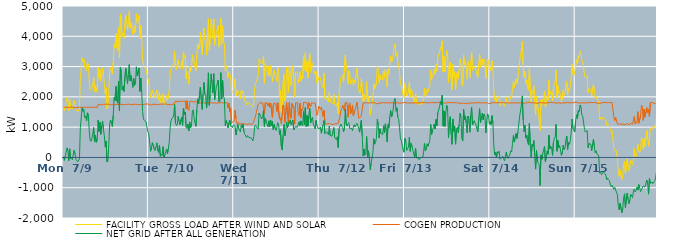
| Category | FACILITY GROSS LOAD AFTER WIND AND SOLAR | COGEN PRODUCTION | NET GRID AFTER ALL GENERATION |
|---|---|---|---|
|  Mon  7/9 | 1678 | 1658 | 20 |
|  Mon  7/9 | 1553 | 1650 | -97 |
|  Mon  7/9 | 1692 | 1657 | 35 |
|  Mon  7/9 | 1666 | 1654 | 12 |
|  Mon  7/9 | 1974 | 1661 | 313 |
|  Mon  7/9 | 1856 | 1638 | 218 |
|  Mon  7/9 | 1541 | 1649 | -108 |
|  Mon  7/9 | 1927 | 1642 | 285 |
|  Mon  7/9 | 1615 | 1661 | -46 |
|  Mon  7/9 | 1659 | 1652 | 7 |
|  Mon  7/9 | 1591 | 1665 | -74 |
|  Mon  7/9 | 1601 | 1652 | -51 |
|  Mon  7/9 | 1880 | 1647 | 233 |
|  Mon  7/9 | 1773 | 1654 | 119 |
|  Mon  7/9 | 1583 | 1644 | -61 |
|  Mon  7/9 | 1572 | 1664 | -92 |
|  Mon  7/9 | 1509 | 1652 | -143 |
|  Mon  7/9 | 1478 | 1648 | -170 |
|  Mon  7/9 | 1608 | 1658 | -50 |
|  Mon  7/9 | 2626 | 1646 | 980 |
|  Mon  7/9 | 2955 | 1654 | 1301 |
|  Mon  7/9 | 3286 | 1650 | 1636 |
|  Mon  7/9 | 3170 | 1649 | 1521 |
|  Mon  7/9 | 3247 | 1661 | 1586 |
|  Mon  7/9 | 2968 | 1654 | 1314 |
|  Mon  7/9 | 3022 | 1652 | 1370 |
|  Mon  7/9 | 2860 | 1658 | 1202 |
|  Mon  7/9 | 3134 | 1662 | 1472 |
|  Mon  7/9 | 3058 | 1661 | 1397 |
|  Mon  7/9 | 2560 | 1666 | 894 |
|  Mon  7/9 | 2221 | 1651 | 570 |
|  Mon  7/9 | 2196 | 1665 | 531 |
|  Mon  7/9 | 2284 | 1665 | 619 |
|  Mon  7/9 | 2429 | 1648 | 781 |
|  Mon  7/9 | 2636 | 1649 | 987 |
|  Mon  7/9 | 2160 | 1652 | 508 |
|  Mon  7/9 | 2381 | 1655 | 726 |
|  Mon  7/9 | 2156 | 1659 | 497 |
|  Mon  7/9 | 2262 | 1649 | 613 |
|  Mon  7/9 | 2984 | 1751 | 1233 |
|  Mon  7/9 | 2602 | 1749 | 853 |
|  Mon  7/9 | 2897 | 1732 | 1165 |
|  Mon  7/9 | 2519 | 1756 | 763 |
|  Mon  7/9 | 2778 | 1740 | 1038 |
|  Mon  7/9 | 2958 | 1761 | 1197 |
|  Mon  7/9 | 2671 | 1757 | 914 |
|  Mon  7/9 | 2457 | 1744 | 713 |
|  Mon  7/9 | 2095 | 1754 | 341 |
|  Mon  7/9 | 2309 | 1766 | 543 |
|  Mon  7/9 | 1607 | 1759 | -152 |
|  Mon  7/9 | 1644 | 1748 | -104 |
|  Mon  7/9 | 2169 | 1757 | 412 |
|  Mon  7/9 | 2860 | 1750 | 1110 |
|  Mon  7/9 | 2966 | 1730 | 1236 |
|  Mon  7/9 | 2861 | 1738 | 1123 |
|  Mon  7/9 | 2765 | 1750 | 1015 |
|  Mon  7/9 | 3154 | 1760 | 1394 |
|  Mon  7/9 | 3733 | 1753 | 1980 |
|  Mon  7/9 | 3624 | 1746 | 1878 |
|  Mon  7/9 | 4086 | 1745 | 2341 |
|  Mon  7/9 | 3622 | 1756 | 1866 |
|  Mon  7/9 | 3537 | 1748 | 1789 |
|  Mon  7/9 | 4282 | 1765 | 2517 |
|  Mon  7/9 | 3290 | 1753 | 1537 |
|  Mon  7/9 | 4743 | 1761 | 2982 |
|  Mon  7/9 | 4587 | 1755 | 2832 |
|  Mon  7/9 | 3975 | 1751 | 2224 |
|  Mon  7/9 | 4095 | 1743 | 2352 |
|  Mon  7/9 | 3936 | 1756 | 2180 |
|  Mon  7/9 | 3935 | 1745 | 2190 |
|  Mon  7/9 | 4697 | 1752 | 2945 |
|  Mon  7/9 | 4514 | 1751 | 2763 |
|  Mon  7/9 | 4197 | 1761 | 2436 |
|  Mon  7/9 | 4495 | 1761 | 2734 |
|  Mon  7/9 | 4827 | 1761 | 3066 |
|  Mon  7/9 | 4269 | 1745 | 2524 |
|  Mon  7/9 | 4457 | 1754 | 2703 |
|  Mon  7/9 | 4271 | 1747 | 2524 |
|  Mon  7/9 | 4061 | 1746 | 2315 |
|  Mon  7/9 | 4371 | 1756 | 2615 |
|  Mon  7/9 | 4116 | 1735 | 2381 |
|  Mon  7/9 | 4187 | 1755 | 2432 |
|  Mon  7/9 | 4749 | 1757 | 2992 |
|  Mon  7/9 | 4442 | 1751 | 2691 |
|  Mon  7/9 | 4416 | 1755 | 2661 |
|  Mon  7/9 | 4694 | 1745 | 2949 |
|  Mon  7/9 | 3934 | 1754 | 2180 |
|  Mon  7/9 | 4362 | 1739 | 2623 |
|  Mon  7/9 | 3905 | 1733 | 2172 |
|  Mon  7/9 | 3261 | 1748 | 1513 |
|  Mon  7/9 | 3025 | 1755 | 1270 |
|  Mon  7/9 | 2971 | 1751 | 1220 |
|  Mon  7/9 | 2986 | 1751 | 1235 |
|  Mon  7/9 | 2934 | 1765 | 1169 |
|  Mon  7/9 | 2727 | 1751 | 976 |
|  Mon  7/9 | 2609 | 1764 | 845 |
|  Tue  7/10 | 2511 | 1740 | 771 |
|  Tue  7/10 | 2527 | 1738 | 789 |
|  Tue  7/10 | 1964 | 1760 | 204 |
|  Tue  7/10 | 2064 | 1732 | 332 |
|  Tue  7/10 | 2225 | 1738 | 487 |
|  Tue  7/10 | 2226 | 1755 | 471 |
|  Tue  7/10 | 2043 | 1752 | 291 |
|  Tue  7/10 | 1980 | 1755 | 225 |
|  Tue  7/10 | 1975 | 1759 | 216 |
|  Tue  7/10 | 2229 | 1750 | 479 |
|  Tue  7/10 | 1998 | 1754 | 244 |
|  Tue  7/10 | 1905 | 1741 | 164 |
|  Tue  7/10 | 2149 | 1750 | 399 |
|  Tue  7/10 | 1795 | 1758 | 37 |
|  Tue  7/10 | 1856 | 1744 | 112 |
|  Tue  7/10 | 1821 | 1756 | 65 |
|  Tue  7/10 | 2099 | 1743 | 356 |
|  Tue  7/10 | 1757 | 1762 | -5 |
|  Tue  7/10 | 1855 | 1765 | 90 |
|  Tue  7/10 | 1835 | 1769 | 66 |
|  Tue  7/10 | 2040 | 1761 | 279 |
|  Tue  7/10 | 1873 | 1749 | 124 |
|  Tue  7/10 | 2047 | 1750 | 297 |
|  Tue  7/10 | 2240 | 1748 | 492 |
|  Tue  7/10 | 2740 | 1739 | 1001 |
|  Tue  7/10 | 2940 | 1728 | 1212 |
|  Tue  7/10 | 3047 | 1766 | 1281 |
|  Tue  7/10 | 3004 | 1745 | 1259 |
|  Tue  7/10 | 3111 | 1742 | 1369 |
|  Tue  7/10 | 3507 | 1757 | 1750 |
|  Tue  7/10 | 3002 | 1863 | 1139 |
|  Tue  7/10 | 2897 | 1846 | 1051 |
|  Tue  7/10 | 2913 | 1827 | 1086 |
|  Tue  7/10 | 3224 | 1869 | 1355 |
|  Tue  7/10 | 3064 | 1868 | 1196 |
|  Tue  7/10 | 2931 | 1846 | 1085 |
|  Tue  7/10 | 2970 | 1871 | 1099 |
|  Tue  7/10 | 3183 | 1853 | 1330 |
|  Tue  7/10 | 2920 | 1861 | 1059 |
|  Tue  7/10 | 3487 | 1857 | 1630 |
|  Tue  7/10 | 3293 | 1871 | 1422 |
|  Tue  7/10 | 3355 | 1857 | 1498 |
|  Tue  7/10 | 2591 | 1594 | 997 |
|  Tue  7/10 | 2827 | 1873 | 954 |
|  Tue  7/10 | 2702 | 1600 | 1102 |
|  Tue  7/10 | 2427 | 1550 | 877 |
|  Tue  7/10 | 3025 | 1854 | 1171 |
|  Tue  7/10 | 2837 | 1852 | 985 |
|  Tue  7/10 | 2917 | 1853 | 1064 |
|  Tue  7/10 | 3388 | 1862 | 1526 |
|  Tue  7/10 | 3405 | 1833 | 1572 |
|  Tue  7/10 | 3127 | 1848 | 1279 |
|  Tue  7/10 | 2964 | 1838 | 1126 |
|  Tue  7/10 | 2859 | 1831 | 1028 |
|  Tue  7/10 | 3396 | 1834 | 1562 |
|  Tue  7/10 | 3743 | 1811 | 1932 |
|  Tue  7/10 | 3581 | 1806 | 1775 |
|  Tue  7/10 | 3617 | 1815 | 1802 |
|  Tue  7/10 | 4118 | 1795 | 2323 |
|  Tue  7/10 | 3704 | 1795 | 1909 |
|  Tue  7/10 | 3393 | 1808 | 1585 |
|  Tue  7/10 | 3895 | 1805 | 2090 |
|  Tue  7/10 | 4275 | 1800 | 2475 |
|  Tue  7/10 | 3890 | 1799 | 2091 |
|  Tue  7/10 | 3836 | 1808 | 2028 |
|  Tue  7/10 | 3377 | 1747 | 1630 |
|  Tue  7/10 | 3956 | 1801 | 2155 |
|  Tue  7/10 | 4587 | 1794 | 2793 |
|  Tue  7/10 | 3519 | 1798 | 1721 |
|  Tue  7/10 | 3877 | 1814 | 2063 |
|  Tue  7/10 | 4572 | 1814 | 2758 |
|  Tue  7/10 | 4285 | 1811 | 2474 |
|  Tue  7/10 | 3917 | 1783 | 2134 |
|  Tue  7/10 | 4574 | 1809 | 2765 |
|  Tue  7/10 | 3706 | 1807 | 1899 |
|  Tue  7/10 | 3917 | 1795 | 2122 |
|  Tue  7/10 | 4152 | 1785 | 2367 |
|  Tue  7/10 | 4237 | 1817 | 2420 |
|  Tue  7/10 | 4361 | 1805 | 2556 |
|  Tue  7/10 | 3643 | 1807 | 1836 |
|  Tue  7/10 | 3680 | 1804 | 1876 |
|  Tue  7/10 | 4595 | 1794 | 2801 |
|  Tue  7/10 | 3742 | 1809 | 1933 |
|  Tue  7/10 | 4346 | 1806 | 2540 |
|  Tue  7/10 | 3818 | 1799 | 2019 |
|  Tue  7/10 | 3745 | 1808 | 1937 |
|  Tue  7/10 | 2849 | 1802 | 1047 |
|  Tue  7/10 | 3034 | 1813 | 1221 |
|  Tue  7/10 | 2946 | 1818 | 1128 |
|  Tue  7/10 | 2617 | 1642 | 975 |
|  Tue  7/10 | 2796 | 1794 | 1002 |
|  Tue  7/10 | 2745 | 1509 | 1236 |
|  Tue  7/10 | 2686 | 1641 | 1045 |
|  Tue  7/10 | 2188 | 1118 | 1070 |
|  Tue  7/10 | 2153 | 1170 | 983 |
|  Tue  7/10 | 2218 | 1146 | 1072 |
|  Wed  7/11 | 2291 | 1201 | 1090 |
|  Wed  7/11 | 2594 | 1560 | 1034 |
|  Wed  7/11 | 2035 | 1298 | 737 |
|  Wed  7/11 | 2027 | 1116 | 911 |
|  Wed  7/11 | 2219 | 1117 | 1102 |
|  Wed  7/11 | 2115 | 1161 | 954 |
|  Wed  7/11 | 2015 | 1090 | 925 |
|  Wed  7/11 | 1940 | 1092 | 848 |
|  Wed  7/11 | 2200 | 1122 | 1078 |
|  Wed  7/11 | 2122 | 1142 | 980 |
|  Wed  7/11 | 2202 | 1105 | 1097 |
|  Wed  7/11 | 1959 | 1117 | 842 |
|  Wed  7/11 | 1875 | 1113 | 762 |
|  Wed  7/11 | 1884 | 1105 | 779 |
|  Wed  7/11 | 1742 | 1082 | 660 |
|  Wed  7/11 | 1835 | 1113 | 722 |
|  Wed  7/11 | 1776 | 1106 | 670 |
|  Wed  7/11 | 1773 | 1106 | 667 |
|  Wed  7/11 | 1760 | 1109 | 651 |
|  Wed  7/11 | 1765 | 1108 | 657 |
|  Wed  7/11 | 1698 | 1075 | 623 |
|  Wed  7/11 | 1663 | 1117 | 546 |
|  Wed  7/11 | 1788 | 1107 | 681 |
|  Wed  7/11 | 2286 | 1275 | 1011 |
|  Wed  7/11 | 2442 | 1367 | 1075 |
|  Wed  7/11 | 2502 | 1488 | 1014 |
|  Wed  7/11 | 2602 | 1619 | 983 |
|  Wed  7/11 | 2677 | 1745 | 932 |
|  Wed  7/11 | 3253 | 1786 | 1467 |
|  Wed  7/11 | 3182 | 1787 | 1395 |
|  Wed  7/11 | 3198 | 1810 | 1388 |
|  Wed  7/11 | 3086 | 1816 | 1270 |
|  Wed  7/11 | 3155 | 1802 | 1353 |
|  Wed  7/11 | 3352 | 1807 | 1545 |
|  Wed  7/11 | 2448 | 1437 | 1011 |
|  Wed  7/11 | 3096 | 1808 | 1288 |
|  Wed  7/11 | 2977 | 1792 | 1185 |
|  Wed  7/11 | 2960 | 1793 | 1167 |
|  Wed  7/11 | 2709 | 1695 | 1014 |
|  Wed  7/11 | 3011 | 1801 | 1210 |
|  Wed  7/11 | 2674 | 1661 | 1013 |
|  Wed  7/11 | 3032 | 1796 | 1236 |
|  Wed  7/11 | 2855 | 1812 | 1043 |
|  Wed  7/11 | 2508 | 1321 | 1187 |
|  Wed  7/11 | 2651 | 1743 | 908 |
|  Wed  7/11 | 2890 | 1803 | 1087 |
|  Wed  7/11 | 2722 | 1747 | 975 |
|  Wed  7/11 | 2674 | 1785 | 889 |
|  Wed  7/11 | 2514 | 1515 | 999 |
|  Wed  7/11 | 2959 | 1807 | 1152 |
|  Wed  7/11 | 2899 | 1814 | 1085 |
|  Wed  7/11 | 2018 | 1264 | 754 |
|  Wed  7/11 | 2217 | 1307 | 910 |
|  Wed  7/11 | 1482 | 1110 | 372 |
|  Wed  7/11 | 1352 | 1109 | 243 |
|  Wed  7/11 | 2462 | 1732 | 730 |
|  Wed  7/11 | 2754 | 1659 | 1095 |
|  Wed  7/11 | 1864 | 1149 | 715 |
|  Wed  7/11 | 2009 | 1126 | 883 |
|  Wed  7/11 | 2977 | 1810 | 1167 |
|  Wed  7/11 | 2779 | 1796 | 983 |
|  Wed  7/11 | 2138 | 1139 | 999 |
|  Wed  7/11 | 2996 | 1814 | 1182 |
|  Wed  7/11 | 2657 | 1413 | 1244 |
|  Wed  7/11 | 2369 | 1292 | 1077 |
|  Wed  7/11 | 2938 | 1779 | 1159 |
|  Wed  7/11 | 3027 | 1791 | 1236 |
|  Wed  7/11 | 2558 | 1652 | 906 |
|  Wed  7/11 | 1996 | 1099 | 897 |
|  Wed  7/11 | 2819 | 1800 | 1019 |
|  Wed  7/11 | 2796 | 1797 | 999 |
|  Wed  7/11 | 2807 | 1814 | 993 |
|  Wed  7/11 | 2453 | 1481 | 972 |
|  Wed  7/11 | 2563 | 1386 | 1177 |
|  Wed  7/11 | 2833 | 1790 | 1043 |
|  Wed  7/11 | 2520 | 1315 | 1205 |
|  Wed  7/11 | 2691 | 1595 | 1096 |
|  Wed  7/11 | 2594 | 1555 | 1039 |
|  Wed  7/11 | 3330 | 1814 | 1516 |
|  Wed  7/11 | 2882 | 1809 | 1073 |
|  Wed  7/11 | 3457 | 1814 | 1643 |
|  Wed  7/11 | 2818 | 1794 | 1024 |
|  Wed  7/11 | 3181 | 1798 | 1383 |
|  Wed  7/11 | 2630 | 1598 | 1032 |
|  Wed  7/11 | 3197 | 1811 | 1386 |
|  Wed  7/11 | 3430 | 1814 | 1616 |
|  Wed  7/11 | 2806 | 1666 | 1140 |
|  Wed  7/11 | 3066 | 1800 | 1266 |
|  Wed  7/11 | 3116 | 1794 | 1322 |
|  Wed  7/11 | 2910 | 1798 | 1112 |
|  Wed  7/11 | 2895 | 1805 | 1090 |
|  Wed  7/11 | 2744 | 1797 | 947 |
|  Wed  7/11 | 2840 | 1617 | 1223 |
|  Wed  7/11 | 2451 | 1386 | 1065 |
|  Wed  7/11 | 2479 | 1445 | 1034 |
|  Wed  7/11 | 2628 | 1692 | 936 |
|  Thu  7/12 | 2688 | 1721 | 967 |
|  Thu  7/12 | 2587 | 1587 | 1000 |
|  Thu  7/12 | 2462 | 1663 | 799 |
|  Thu  7/12 | 2475 | 1521 | 954 |
|  Thu  7/12 | 2299 | 1354 | 945 |
|  Thu  7/12 | 2773 | 1555 | 1218 |
|  Thu  7/12 | 1955 | 1171 | 784 |
|  Thu  7/12 | 1902 | 1099 | 803 |
|  Thu  7/12 | 1950 | 1101 | 849 |
|  Thu  7/12 | 1919 | 1111 | 808 |
|  Thu  7/12 | 1828 | 1081 | 747 |
|  Thu  7/12 | 2154 | 1120 | 1034 |
|  Thu  7/12 | 1832 | 1109 | 723 |
|  Thu  7/12 | 1834 | 1097 | 737 |
|  Thu  7/12 | 1816 | 1112 | 704 |
|  Thu  7/12 | 1777 | 1082 | 695 |
|  Thu  7/12 | 2091 | 1105 | 986 |
|  Thu  7/12 | 1767 | 1111 | 656 |
|  Thu  7/12 | 1746 | 1110 | 636 |
|  Thu  7/12 | 1694 | 1113 | 581 |
|  Thu  7/12 | 1807 | 1126 | 681 |
|  Thu  7/12 | 1451 | 1122 | 329 |
|  Thu  7/12 | 2076 | 1134 | 942 |
|  Thu  7/12 | 2396 | 1361 | 1035 |
|  Thu  7/12 | 2646 | 1543 | 1103 |
|  Thu  7/12 | 2635 | 1598 | 1037 |
|  Thu  7/12 | 2713 | 1727 | 986 |
|  Thu  7/12 | 2483 | 1631 | 852 |
|  Thu  7/12 | 2498 | 1530 | 968 |
|  Thu  7/12 | 3386 | 1804 | 1582 |
|  Thu  7/12 | 2910 | 1808 | 1102 |
|  Thu  7/12 | 2844 | 1807 | 1037 |
|  Thu  7/12 | 2436 | 1329 | 1107 |
|  Thu  7/12 | 2865 | 1719 | 1146 |
|  Thu  7/12 | 2749 | 1796 | 953 |
|  Thu  7/12 | 2415 | 1444 | 971 |
|  Thu  7/12 | 2530 | 1567 | 963 |
|  Thu  7/12 | 2601 | 1724 | 877 |
|  Thu  7/12 | 2379 | 1379 | 1000 |
|  Thu  7/12 | 2549 | 1463 | 1086 |
|  Thu  7/12 | 2455 | 1452 | 1003 |
|  Thu  7/12 | 2700 | 1699 | 1001 |
|  Thu  7/12 | 2945 | 1819 | 1126 |
|  Thu  7/12 | 2660 | 1600 | 1060 |
|  Thu  7/12 | 2264 | 1299 | 965 |
|  Thu  7/12 | 2108 | 1272 | 836 |
|  Thu  7/12 | 2160 | 1325 | 835 |
|  Thu  7/12 | 2610 | 1387 | 1223 |
|  Thu  7/12 | 2305 | 1587 | 718 |
|  Thu  7/12 | 1847 | 1801 | 46 |
|  Thu  7/12 | 2089 | 1809 | 280 |
|  Thu  7/12 | 1870 | 1798 | 72 |
|  Thu  7/12 | 1925 | 1796 | 129 |
|  Thu  7/12 | 2498 | 1808 | 690 |
|  Thu  7/12 | 1828 | 1809 | 19 |
|  Thu  7/12 | 2017 | 1797 | 220 |
|  Thu  7/12 | 1793 | 1809 | -16 |
|  Thu  7/12 | 1395 | 1810 | -415 |
|  Thu  7/12 | 1610 | 1799 | -189 |
|  Thu  7/12 | 1777 | 1797 | -20 |
|  Thu  7/12 | 1961 | 1804 | 157 |
|  Thu  7/12 | 2437 | 1820 | 617 |
|  Thu  7/12 | 2261 | 1824 | 437 |
|  Thu  7/12 | 2279 | 1783 | 496 |
|  Thu  7/12 | 2456 | 1803 | 653 |
|  Thu  7/12 | 3030 | 1766 | 1264 |
|  Thu  7/12 | 2863 | 1801 | 1062 |
|  Thu  7/12 | 2449 | 1802 | 647 |
|  Thu  7/12 | 2727 | 1780 | 947 |
|  Thu  7/12 | 2579 | 1785 | 794 |
|  Thu  7/12 | 2623 | 1811 | 812 |
|  Thu  7/12 | 2553 | 1800 | 753 |
|  Thu  7/12 | 2855 | 1809 | 1046 |
|  Thu  7/12 | 2619 | 1802 | 817 |
|  Thu  7/12 | 2910 | 1801 | 1109 |
|  Thu  7/12 | 2695 | 1816 | 879 |
|  Thu  7/12 | 2324 | 1810 | 514 |
|  Thu  7/12 | 2899 | 1816 | 1083 |
|  Thu  7/12 | 2776 | 1794 | 982 |
|  Thu  7/12 | 3153 | 1805 | 1348 |
|  Thu  7/12 | 3352 | 1802 | 1550 |
|  Thu  7/12 | 3144 | 1810 | 1334 |
|  Thu  7/12 | 3207 | 1805 | 1402 |
|  Thu  7/12 | 3188 | 1796 | 1392 |
|  Thu  7/12 | 3671 | 1780 | 1891 |
|  Thu  7/12 | 3755 | 1808 | 1947 |
|  Thu  7/12 | 3342 | 1813 | 1529 |
|  Thu  7/12 | 3461 | 1823 | 1638 |
|  Thu  7/12 | 3140 | 1800 | 1340 |
|  Thu  7/12 | 3057 | 1801 | 1256 |
|  Thu  7/12 | 2772 | 1792 | 980 |
|  Thu  7/12 | 2411 | 1802 | 609 |
|  Thu  7/12 | 2369 | 1796 | 573 |
|  Thu  7/12 | 2192 | 1814 | 378 |
|  Thu  7/12 | 2048 | 1808 | 240 |
|  Thu  7/12 | 1979 | 1809 | 170 |
|  Fri  7/13 | 2436 | 1813 | 623 |
|  Fri  7/13 | 2341 | 1800 | 541 |
|  Fri  7/13 | 2032 | 1802 | 230 |
|  Fri  7/13 | 2041 | 1825 | 216 |
|  Fri  7/13 | 2143 | 1799 | 344 |
|  Fri  7/13 | 2492 | 1830 | 662 |
|  Fri  7/13 | 1993 | 1790 | 203 |
|  Fri  7/13 | 2248 | 1785 | 463 |
|  Fri  7/13 | 2191 | 1809 | 382 |
|  Fri  7/13 | 2027 | 1808 | 219 |
|  Fri  7/13 | 1893 | 1790 | 103 |
|  Fri  7/13 | 1810 | 1803 | 7 |
|  Fri  7/13 | 2109 | 1804 | 305 |
|  Fri  7/13 | 1775 | 1794 | -19 |
|  Fri  7/13 | 1752 | 1794 | -42 |
|  Fri  7/13 | 1800 | 1801 | -1 |
|  Fri  7/13 | 1725 | 1801 | -76 |
|  Fri  7/13 | 1724 | 1821 | -97 |
|  Fri  7/13 | 1806 | 1810 | -4 |
|  Fri  7/13 | 1755 | 1789 | -34 |
|  Fri  7/13 | 1813 | 1811 | 2 |
|  Fri  7/13 | 1960 | 1815 | 145 |
|  Fri  7/13 | 2283 | 1808 | 475 |
|  Fri  7/13 | 2001 | 1787 | 214 |
|  Fri  7/13 | 2066 | 1810 | 256 |
|  Fri  7/13 | 2263 | 1813 | 450 |
|  Fri  7/13 | 2169 | 1802 | 367 |
|  Fri  7/13 | 2162 | 1793 | 369 |
|  Fri  7/13 | 2361 | 1799 | 562 |
|  Fri  7/13 | 2884 | 1789 | 1095 |
|  Fri  7/13 | 2579 | 1817 | 762 |
|  Fri  7/13 | 2671 | 1797 | 874 |
|  Fri  7/13 | 2797 | 1808 | 989 |
|  Fri  7/13 | 2921 | 1815 | 1106 |
|  Fri  7/13 | 2744 | 1807 | 937 |
|  Fri  7/13 | 3074 | 1820 | 1254 |
|  Fri  7/13 | 2846 | 1805 | 1041 |
|  Fri  7/13 | 3291 | 1809 | 1482 |
|  Fri  7/13 | 3286 | 1826 | 1460 |
|  Fri  7/13 | 3479 | 1812 | 1667 |
|  Fri  7/13 | 3630 | 1787 | 1843 |
|  Fri  7/13 | 3556 | 1813 | 1743 |
|  Fri  7/13 | 3847 | 1793 | 2054 |
|  Fri  7/13 | 2818 | 1785 | 1033 |
|  Fri  7/13 | 3333 | 1798 | 1535 |
|  Fri  7/13 | 2827 | 1803 | 1024 |
|  Fri  7/13 | 3278 | 1795 | 1483 |
|  Fri  7/13 | 3529 | 1810 | 1719 |
|  Fri  7/13 | 3429 | 1802 | 1627 |
|  Fri  7/13 | 2458 | 1811 | 647 |
|  Fri  7/13 | 3003 | 1815 | 1188 |
|  Fri  7/13 | 3150 | 1803 | 1347 |
|  Fri  7/13 | 2582 | 1807 | 775 |
|  Fri  7/13 | 2235 | 1803 | 432 |
|  Fri  7/13 | 3076 | 1806 | 1270 |
|  Fri  7/13 | 2653 | 1791 | 862 |
|  Fri  7/13 | 2834 | 1805 | 1029 |
|  Fri  7/13 | 2243 | 1806 | 437 |
|  Fri  7/13 | 2743 | 1814 | 929 |
|  Fri  7/13 | 2814 | 1817 | 997 |
|  Fri  7/13 | 2602 | 1788 | 814 |
|  Fri  7/13 | 2893 | 1803 | 1090 |
|  Fri  7/13 | 3249 | 1794 | 1455 |
|  Fri  7/13 | 3138 | 1799 | 1339 |
|  Fri  7/13 | 2417 | 1790 | 627 |
|  Fri  7/13 | 2354 | 1811 | 543 |
|  Fri  7/13 | 3374 | 1790 | 1584 |
|  Fri  7/13 | 3057 | 1808 | 1249 |
|  Fri  7/13 | 3159 | 1788 | 1371 |
|  Fri  7/13 | 2940 | 1806 | 1134 |
|  Fri  7/13 | 2580 | 1769 | 811 |
|  Fri  7/13 | 3164 | 1798 | 1366 |
|  Fri  7/13 | 3107 | 1808 | 1299 |
|  Fri  7/13 | 2628 | 1795 | 833 |
|  Fri  7/13 | 3161 | 1786 | 1375 |
|  Fri  7/13 | 3476 | 1817 | 1659 |
|  Fri  7/13 | 2876 | 1803 | 1073 |
|  Fri  7/13 | 2972 | 1810 | 1162 |
|  Fri  7/13 | 3008 | 1795 | 1213 |
|  Fri  7/13 | 2982 | 1788 | 1194 |
|  Fri  7/13 | 2866 | 1811 | 1055 |
|  Fri  7/13 | 2742 | 1802 | 940 |
|  Fri  7/13 | 2649 | 1804 | 845 |
|  Fri  7/13 | 3080 | 1796 | 1284 |
|  Fri  7/13 | 3416 | 1806 | 1610 |
|  Fri  7/13 | 2977 | 1824 | 1153 |
|  Fri  7/13 | 3085 | 1793 | 1292 |
|  Fri  7/13 | 3254 | 1787 | 1467 |
|  Fri  7/13 | 3057 | 1810 | 1247 |
|  Fri  7/13 | 3240 | 1806 | 1434 |
|  Fri  7/13 | 3164 | 1793 | 1371 |
|  Fri  7/13 | 2605 | 1796 | 809 |
|  Fri  7/13 | 3010 | 1815 | 1195 |
|  Fri  7/13 | 3246 | 1808 | 1438 |
|  Fri  7/13 | 3169 | 1779 | 1390 |
|  Fri  7/13 | 2903 | 1804 | 1099 |
|  Sat  7/14 | 2972 | 1780 | 1192 |
|  Sat  7/14 | 2860 | 1787 | 1073 |
|  Sat  7/14 | 3186 | 1807 | 1379 |
|  Sat  7/14 | 2912 | 1786 | 1126 |
|  Sat  7/14 | 2198 | 1806 | 392 |
|  Sat  7/14 | 1890 | 1799 | 91 |
|  Sat  7/14 | 1984 | 1810 | 174 |
|  Sat  7/14 | 1809 | 1814 | -5 |
|  Sat  7/14 | 1985 | 1799 | 186 |
|  Sat  7/14 | 1944 | 1802 | 142 |
|  Sat  7/14 | 2020 | 1812 | 208 |
|  Sat  7/14 | 1727 | 1788 | -61 |
|  Sat  7/14 | 1743 | 1806 | -63 |
|  Sat  7/14 | 1809 | 1810 | -1 |
|  Sat  7/14 | 1846 | 1808 | 38 |
|  Sat  7/14 | 1847 | 1815 | 32 |
|  Sat  7/14 | 1684 | 1795 | -111 |
|  Sat  7/14 | 1815 | 1793 | 22 |
|  Sat  7/14 | 1983 | 1807 | 176 |
|  Sat  7/14 | 1820 | 1797 | 23 |
|  Sat  7/14 | 1767 | 1800 | -33 |
|  Sat  7/14 | 1827 | 1796 | 31 |
|  Sat  7/14 | 1891 | 1799 | 92 |
|  Sat  7/14 | 2037 | 1821 | 216 |
|  Sat  7/14 | 1981 | 1800 | 181 |
|  Sat  7/14 | 2255 | 1802 | 453 |
|  Sat  7/14 | 2529 | 1805 | 724 |
|  Sat  7/14 | 2300 | 1794 | 506 |
|  Sat  7/14 | 2312 | 1794 | 518 |
|  Sat  7/14 | 2585 | 1797 | 788 |
|  Sat  7/14 | 2436 | 1806 | 630 |
|  Sat  7/14 | 2620 | 1789 | 831 |
|  Sat  7/14 | 2883 | 1792 | 1091 |
|  Sat  7/14 | 3171 | 1812 | 1359 |
|  Sat  7/14 | 3138 | 1806 | 1332 |
|  Sat  7/14 | 3532 | 1806 | 1726 |
|  Sat  7/14 | 3826 | 1795 | 2031 |
|  Sat  7/14 | 3040 | 1802 | 1238 |
|  Sat  7/14 | 2638 | 1785 | 853 |
|  Sat  7/14 | 2847 | 1786 | 1061 |
|  Sat  7/14 | 2448 | 1805 | 643 |
|  Sat  7/14 | 2558 | 1820 | 738 |
|  Sat  7/14 | 2306 | 1802 | 504 |
|  Sat  7/14 | 2219 | 1812 | 407 |
|  Sat  7/14 | 2938 | 1818 | 1120 |
|  Sat  7/14 | 2213 | 1803 | 410 |
|  Sat  7/14 | 1818 | 1802 | 16 |
|  Sat  7/14 | 2224 | 1796 | 428 |
|  Sat  7/14 | 2163 | 1802 | 361 |
|  Sat  7/14 | 2359 | 1800 | 559 |
|  Sat  7/14 | 1846 | 1805 | 41 |
|  Sat  7/14 | 1411 | 1797 | -386 |
|  Sat  7/14 | 2019 | 1786 | 233 |
|  Sat  7/14 | 1678 | 1812 | -134 |
|  Sat  7/14 | 1598 | 1792 | -194 |
|  Sat  7/14 | 1565 | 1804 | -239 |
|  Sat  7/14 | 890 | 1817 | -927 |
|  Sat  7/14 | 1895 | 1811 | 84 |
|  Sat  7/14 | 1738 | 1805 | -67 |
|  Sat  7/14 | 1913 | 1787 | 126 |
|  Sat  7/14 | 1951 | 1798 | 153 |
|  Sat  7/14 | 2170 | 1808 | 362 |
|  Sat  7/14 | 1651 | 1796 | -145 |
|  Sat  7/14 | 1797 | 1792 | 5 |
|  Sat  7/14 | 2018 | 1799 | 219 |
|  Sat  7/14 | 1897 | 1794 | 103 |
|  Sat  7/14 | 2547 | 1810 | 737 |
|  Sat  7/14 | 2075 | 1798 | 277 |
|  Sat  7/14 | 2177 | 1812 | 365 |
|  Sat  7/14 | 2123 | 1808 | 315 |
|  Sat  7/14 | 1871 | 1807 | 64 |
|  Sat  7/14 | 2290 | 1798 | 492 |
|  Sat  7/14 | 2425 | 1810 | 615 |
|  Sat  7/14 | 2487 | 1805 | 682 |
|  Sat  7/14 | 2879 | 1785 | 1094 |
|  Sat  7/14 | 1986 | 1783 | 203 |
|  Sat  7/14 | 2371 | 1807 | 564 |
|  Sat  7/14 | 2120 | 1798 | 322 |
|  Sat  7/14 | 2191 | 1797 | 394 |
|  Sat  7/14 | 2216 | 1817 | 399 |
|  Sat  7/14 | 1844 | 1776 | 68 |
|  Sat  7/14 | 1982 | 1811 | 171 |
|  Sat  7/14 | 2229 | 1819 | 410 |
|  Sat  7/14 | 2051 | 1796 | 255 |
|  Sat  7/14 | 2099 | 1796 | 303 |
|  Sat  7/14 | 2368 | 1805 | 563 |
|  Sat  7/14 | 2508 | 1800 | 708 |
|  Sat  7/14 | 2082 | 1817 | 265 |
|  Sat  7/14 | 2294 | 1803 | 491 |
|  Sat  7/14 | 2235 | 1802 | 433 |
|  Sat  7/14 | 2365 | 1804 | 561 |
|  Sat  7/14 | 2641 | 1805 | 836 |
|  Sat  7/14 | 3078 | 1814 | 1264 |
|  Sat  7/14 | 2755 | 1801 | 954 |
|  Sat  7/14 | 2691 | 1786 | 905 |
|  Sat  7/14 | 2659 | 1822 | 837 |
|  Sun  7/15 | 2995 | 1794 | 1201 |
|  Sun  7/15 | 3224 | 1814 | 1410 |
|  Sun  7/15 | 3097 | 1810 | 1287 |
|  Sun  7/15 | 3356 | 1806 | 1550 |
|  Sun  7/15 | 3310 | 1799 | 1511 |
|  Sun  7/15 | 3513 | 1783 | 1730 |
|  Sun  7/15 | 3455 | 1799 | 1656 |
|  Sun  7/15 | 3215 | 1817 | 1398 |
|  Sun  7/15 | 3160 | 1803 | 1357 |
|  Sun  7/15 | 3129 | 1789 | 1340 |
|  Sun  7/15 | 2713 | 1790 | 923 |
|  Sun  7/15 | 2649 | 1809 | 840 |
|  Sun  7/15 | 2650 | 1811 | 839 |
|  Sun  7/15 | 2684 | 1798 | 886 |
|  Sun  7/15 | 2131 | 1813 | 318 |
|  Sun  7/15 | 2263 | 1803 | 460 |
|  Sun  7/15 | 2240 | 1804 | 436 |
|  Sun  7/15 | 2255 | 1818 | 437 |
|  Sun  7/15 | 2031 | 1808 | 223 |
|  Sun  7/15 | 2244 | 1807 | 437 |
|  Sun  7/15 | 2415 | 1816 | 599 |
|  Sun  7/15 | 2184 | 1815 | 369 |
|  Sun  7/15 | 1958 | 1804 | 154 |
|  Sun  7/15 | 2023 | 1802 | 221 |
|  Sun  7/15 | 1916 | 1808 | 108 |
|  Sun  7/15 | 1924 | 1787 | 137 |
|  Sun  7/15 | 1860 | 1798 | 62 |
|  Sun  7/15 | 1262 | 1786 | -524 |
|  Sun  7/15 | 1334 | 1802 | -468 |
|  Sun  7/15 | 1225 | 1796 | -571 |
|  Sun  7/15 | 1203 | 1802 | -599 |
|  Sun  7/15 | 1334 | 1819 | -485 |
|  Sun  7/15 | 1293 | 1805 | -512 |
|  Sun  7/15 | 1283 | 1813 | -530 |
|  Sun  7/15 | 1222 | 1807 | -585 |
|  Sun  7/15 | 1063 | 1805 | -742 |
|  Sun  7/15 | 1105 | 1795 | -690 |
|  Sun  7/15 | 1083 | 1808 | -725 |
|  Sun  7/15 | 1043 | 1807 | -764 |
|  Sun  7/15 | 914 | 1818 | -904 |
|  Sun  7/15 | 840 | 1807 | -967 |
|  Sun  7/15 | 883 | 1801 | -918 |
|  Sun  7/15 | 881 | 1784 | -903 |
|  Sun  7/15 | 279 | 1331 | -1052 |
|  Sun  7/15 | 229 | 1216 | -987 |
|  Sun  7/15 | 248 | 1322 | -1074 |
|  Sun  7/15 | 212 | 1315 | -1103 |
|  Sun  7/15 | -130 | 1105 | -1235 |
|  Sun  7/15 | -505 | 1110 | -1615 |
|  Sun  7/15 | -629 | 1101 | -1730 |
|  Sun  7/15 | -404 | 1108 | -1512 |
|  Sun  7/15 | -399 | 1095 | -1494 |
|  Sun  7/15 | -723 | 1094 | -1817 |
|  Sun  7/15 | -588 | 1107 | -1695 |
|  Sun  7/15 | -207 | 1119 | -1326 |
|  Sun  7/15 | -122 | 1079 | -1201 |
|  Sun  7/15 | -542 | 1111 | -1653 |
|  Sun  7/15 | -566 | 1092 | -1658 |
|  Sun  7/15 | -48 | 1127 | -1175 |
|  Sun  7/15 | -296 | 1098 | -1394 |
|  Sun  7/15 | -444 | 1082 | -1526 |
|  Sun  7/15 | -283 | 1103 | -1386 |
|  Sun  7/15 | -95 | 1121 | -1216 |
|  Sun  7/15 | -113 | 1109 | -1222 |
|  Sun  7/15 | -232 | 1096 | -1328 |
|  Sun  7/15 | -23 | 1082 | -1105 |
|  Sun  7/15 | 305 | 1350 | -1045 |
|  Sun  7/15 | -27 | 1116 | -1143 |
|  Sun  7/15 | 10 | 1092 | -1082 |
|  Sun  7/15 | 170 | 1144 | -974 |
|  Sun  7/15 | 430 | 1510 | -1080 |
|  Sun  7/15 | 232 | 1129 | -897 |
|  Sun  7/15 | 156 | 1159 | -1003 |
|  Sun  7/15 | 236 | 1365 | -1129 |
|  Sun  7/15 | 653 | 1724 | -1071 |
|  Sun  7/15 | 569 | 1646 | -1077 |
|  Sun  7/15 | 280 | 1224 | -944 |
|  Sun  7/15 | 619 | 1593 | -974 |
|  Sun  7/15 | 347 | 1326 | -979 |
|  Sun  7/15 | 346 | 1342 | -996 |
|  Sun  7/15 | 889 | 1639 | -750 |
|  Sun  7/15 | 619 | 1486 | -867 |
|  Sun  7/15 | 373 | 1587 | -1214 |
|  Sun  7/15 | 658 | 1353 | -695 |
|  Sun  7/15 | 946 | 1805 | -859 |
|  Sun  7/15 | 938 | 1810 | -872 |
|  Sun  7/15 | 1002 | 1813 | -811 |
|  Sun  7/15 | 938 | 1804 | -866 |
|  Sun  7/15 | 973 | 1788 | -815 |
|  Sun  7/15 | 1024 | 1791 | -767 |
|  Sun  7/15 | 1104 | 1782 | -678 |
|  Sun  7/15 | 1346 | 1794 | -448 |